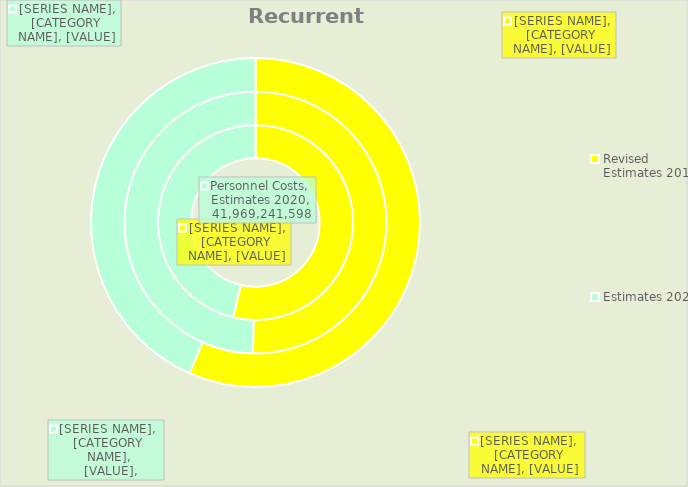
| Category | Personnel Costs | Overhead Costs | Transfer of Revenue Surplus to Capital Development Fund |
|---|---|---|---|
| Revised Estimates 2019 | 48674729140 | 37461054862 | 18205483673 |
| Estimates 2020 | 41969241598.498 | 36999887139 | 13963380503.503 |